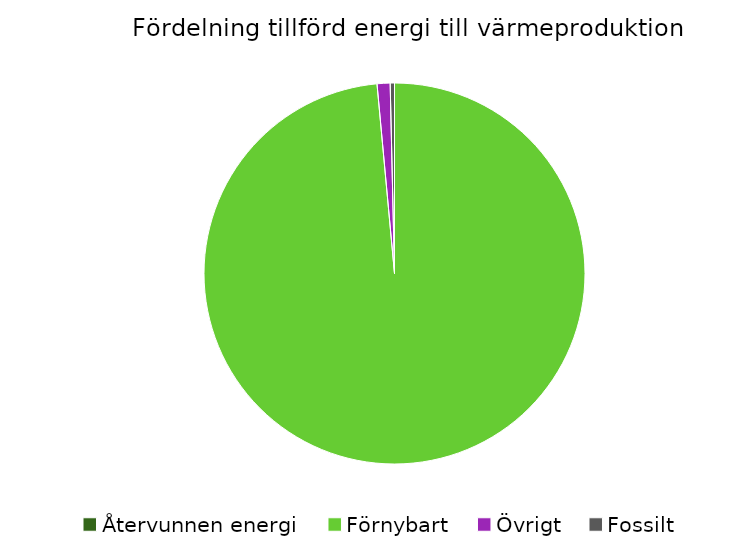
| Category | Fördelning värmeproduktion |
|---|---|
| Återvunnen energi | 0 |
| Förnybart | 0.985 |
| Övrigt | 0.011 |
| Fossilt | 0.004 |